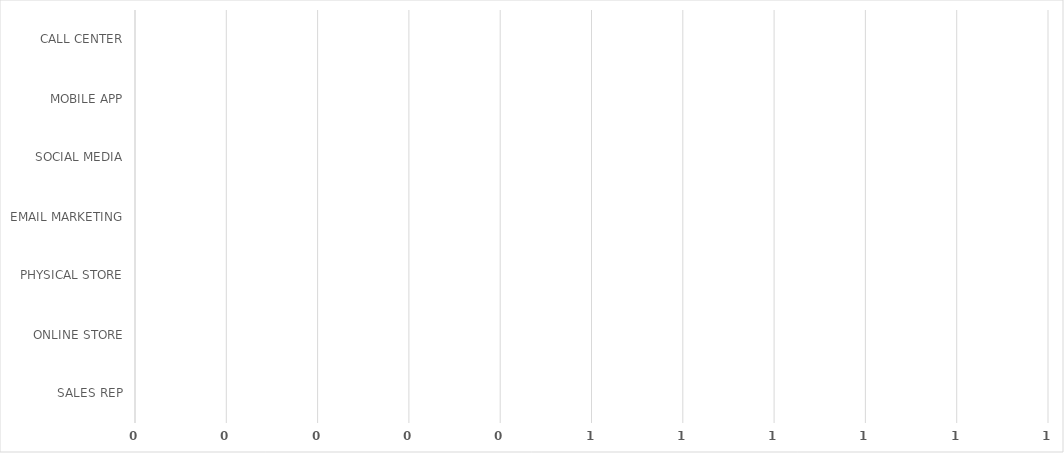
| Category | Series 0 |
|---|---|
| SALES REP | 0 |
| ONLINE STORE | 0 |
| PHYSICAL STORE | 0 |
| EMAIL MARKETING | 0 |
| SOCIAL MEDIA | 0 |
| MOBILE APP | 0 |
| CALL CENTER | 0 |